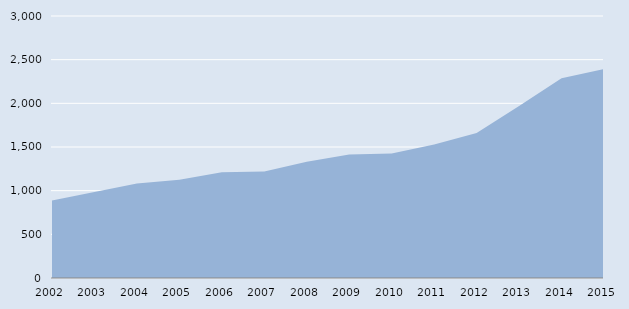
| Category | Series 0 |
|---|---|
| 2002.0 | 888 |
| 2003.0 | 986 |
| 2004.0 | 1081 |
| 2005.0 | 1125 |
| 2006.0 | 1210 |
| 2007.0 | 1220 |
| 2008.0 | 1332 |
| 2009.0 | 1413 |
| 2010.0 | 1427 |
| 2011.0 | 1530 |
| 2012.0 | 1660 |
| 2013.0 | 1969 |
| 2014.0 | 2288 |
| 2015.0 | 2394 |